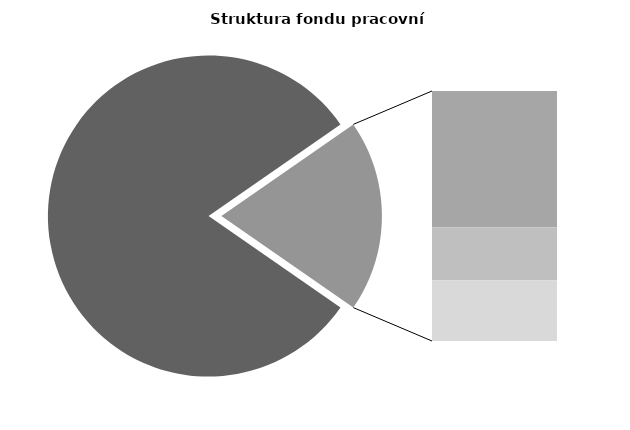
| Category | Series 0 |
|---|---|
| Průměrná měsíční odpracovaná doba bez přesčasu | 138.601 |
| Dovolená | 18.077 |
| Nemoc | 7.054 |
| Jiné | 8.066 |